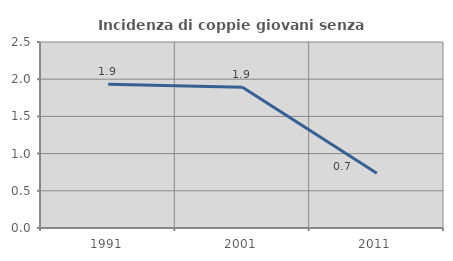
| Category | Incidenza di coppie giovani senza figli |
|---|---|
| 1991.0 | 1.934 |
| 2001.0 | 1.893 |
| 2011.0 | 0.735 |